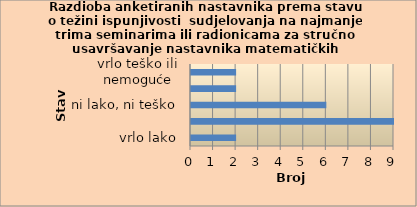
| Category | Series 0 |
|---|---|
| vrlo lako | 2 |
| lako | 9 |
| ni lako, ni teško | 6 |
| teško | 2 |
| vrlo teško ili nemoguće | 2 |